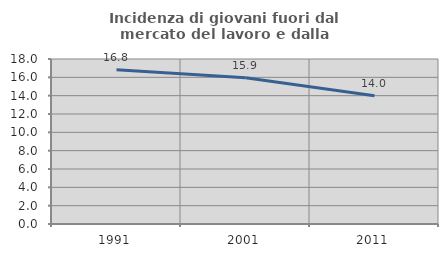
| Category | Incidenza di giovani fuori dal mercato del lavoro e dalla formazione  |
|---|---|
| 1991.0 | 16.835 |
| 2001.0 | 15.946 |
| 2011.0 | 13.986 |